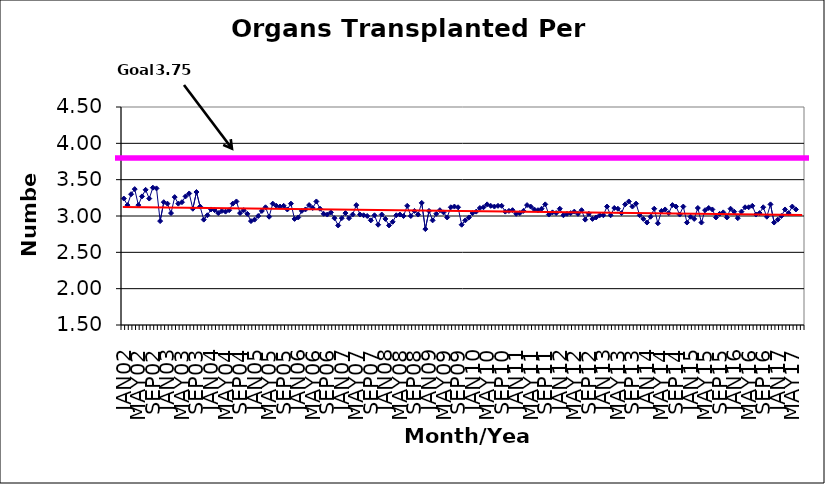
| Category | Series 0 |
|---|---|
| JAN02 | 3.24 |
| FEB02 | 3.15 |
| MAR02 | 3.3 |
| APR02 | 3.37 |
| MAY02 | 3.15 |
| JUN02 | 3.27 |
| JUL02 | 3.36 |
| AUG02 | 3.24 |
| SEP02 | 3.39 |
| OCT02 | 3.38 |
| NOV02 | 2.93 |
| DEC02 | 3.19 |
| JAN03 | 3.17 |
| FEB03 | 3.04 |
| MAR03 | 3.26 |
| APR03 | 3.17 |
| MAY03 | 3.19 |
| JUN03 | 3.27 |
| JUL03 | 3.31 |
| AUG03 | 3.1 |
| SEP03 | 3.33 |
| OCT03 | 3.13 |
| NOV03 | 2.95 |
| DEC03 | 3.01 |
| JAN04 | 3.09 |
| FEB04 | 3.08 |
| MAR04 | 3.04 |
| APR04 | 3.07 |
| MAY04 | 3.06 |
| JUN04 | 3.08 |
| JUL04 | 3.17 |
| AUG04 | 3.2 |
| SEP04 | 3.04 |
| OCT04 | 3.08 |
| NOV04 | 3.03 |
| DEC04 | 2.93 |
| JAN05 | 2.95 |
| FEB05 | 3 |
| MAR05 | 3.07 |
| APR05 | 3.12 |
| MAY05 | 2.99 |
| JUN05 | 3.17 |
| JUL05 | 3.14 |
| AUG05 | 3.13 |
| SEP05 | 3.14 |
| OCT05 | 3.09 |
| NOV05 | 3.17 |
| DEC05 | 2.96 |
| JAN06 | 2.98 |
| FEB06 | 3.07 |
| MAR06 | 3.09 |
| APR06 | 3.15 |
| MAY06 | 3.11 |
| JUN06 | 3.2 |
| JUL06 | 3.1 |
| AUG06 | 3.03 |
| SEP06 | 3.02 |
| OCT06 | 3.05 |
| NOV06 | 2.97 |
| DEC06 | 2.87 |
| JAN07 | 2.97 |
| FEB07 | 3.04 |
| MAR07 | 2.97 |
| APR07 | 3.02 |
| MAY07 | 3.15 |
| JUN07 | 3.02 |
| JUL07 | 3.01 |
| AUG07 | 3 |
| SEP07 | 2.94 |
| OCT07 | 3.01 |
| NOV07 | 2.88 |
| DEC07 | 3.02 |
| JAN08 | 2.96 |
| FEB08 | 2.87 |
| MAR08 | 2.92 |
| APR08 | 3.01 |
| MAY08 | 3.02 |
| JUN08 | 3 |
| JUL08 | 3.14 |
| AUG08 | 3 |
| SEP08 | 3.07 |
| OCT08 | 3.02 |
| NOV08 | 3.18 |
| DEC08 | 2.82 |
| JAN09 | 3.07 |
| FEB09 | 2.94 |
| MAR09 | 3.03 |
| APR09 | 3.08 |
| MAY09 | 3.05 |
| JUN09 | 2.98 |
| JUL09 | 3.12 |
| AUG09 | 3.13 |
| SEP09 | 3.12 |
| OCT09 | 2.88 |
| NOV09 | 2.94 |
| DEC09 | 2.98 |
| JAN10 | 3.04 |
| FEB10 | 3.06 |
| MAR10 | 3.11 |
| APR10 | 3.12 |
| MAY10 | 3.16 |
| JUN10 | 3.14 |
| JUL10 | 3.13 |
| AUG10 | 3.14 |
| SEP10 | 3.14 |
| OCT10 | 3.06 |
| NOV10 | 3.07 |
| DEC10 | 3.08 |
| JAN11 | 3.03 |
| FEB11 | 3.04 |
| MAR11 | 3.07 |
| APR11 | 3.15 |
| MAY11 | 3.13 |
| JUN11 | 3.09 |
| JUL11 | 3.08 |
| AUG11 | 3.1 |
| SEP11 | 3.16 |
| OCT11 | 3.02 |
| NOV11 | 3.05 |
| DEC11 | 3.04 |
| JAN12 | 3.1 |
| FEB12 | 3.01 |
| MAR12 | 3.03 |
| APR12 | 3.04 |
| MAY12 | 3.06 |
| JUN12 | 3.03 |
| JUL12 | 3.08 |
| AUG12 | 2.95 |
| SEP12 | 3.03 |
| OCT12 | 2.96 |
| NOV12 | 2.98 |
| DEC12 | 3.01 |
| JAN13 | 3.01 |
| FEB13 | 3.13 |
| MAR13 | 3.01 |
| APR13 | 3.11 |
| MAY13 | 3.1 |
| JUN13 | 3.04 |
| JUL13 | 3.16 |
| AUG13 | 3.2 |
| SEP13 | 3.13 |
| OCT13 | 3.17 |
| NOV13 | 3.01 |
| DEC13 | 2.96 |
| JAN14 | 2.91 |
| FEB14 | 2.99 |
| MAR14 | 3.1 |
| APR14 | 2.9 |
| MAY14 | 3.07 |
| JUN14 | 3.09 |
| JUL14 | 3.04 |
| AUG14 | 3.15 |
| SEP14 | 3.13 |
| OCT14 | 3.02 |
| NOV14 | 3.13 |
| DEC14 | 2.91 |
| JAN15 | 2.99 |
| FEB15 | 2.96 |
| MAR15 | 3.11 |
| APR15 | 2.91 |
| MAY15 | 3.08 |
| JUN15 | 3.11 |
| JUL15 | 3.09 |
| AUG15 | 2.98 |
| SEP15 | 3.03 |
| OCT15 | 3.05 |
| NOV15 | 2.98 |
| DEC15 | 3.1 |
| JAN16 | 3.06 |
| FEB16 | 2.97 |
| MAR16 | 3.06 |
| APR16 | 3.12 |
| MAY16 | 3.12 |
| JUN16 | 3.14 |
| JUL16 | 3.02 |
| AUG16 | 3.04 |
| SEP16 | 3.12 |
| OCT16 | 2.99 |
| NOV16 | 3.16 |
| DEC16 | 2.91 |
| JAN17 | 2.95 |
| FEB17 | 3 |
| MAR17 | 3.09 |
| APR17 | 3.04 |
| MAY17 | 3.13 |
| JUN17 | 3.09 |